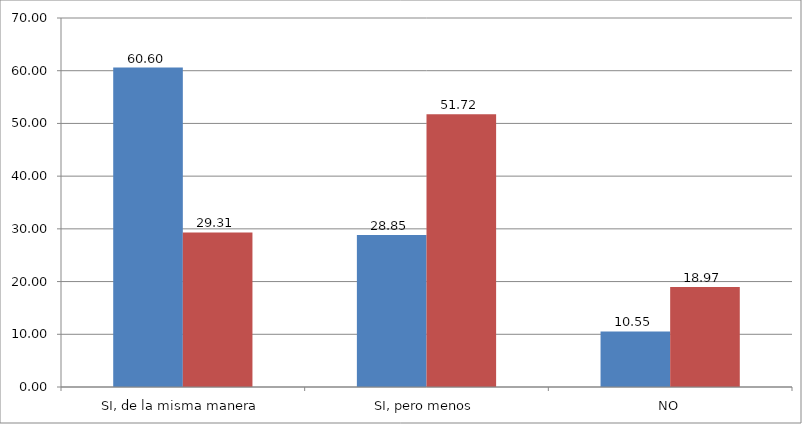
| Category | ¿Presentarías trabajos en los eventos científicos si no estuvieran valorados en OPEs, bolsas de trabajo y carrera profesional? | Series 1 |
|---|---|---|
| SI, de la misma manera | 60.6 | 29.31 |
| SI, pero menos | 28.848 | 51.724 |
| NO | 10.552 | 18.966 |